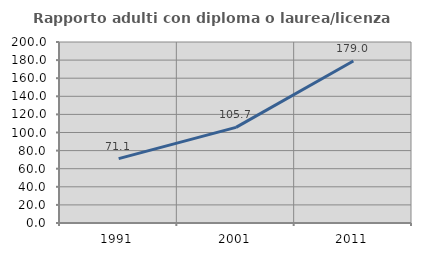
| Category | Rapporto adulti con diploma o laurea/licenza media  |
|---|---|
| 1991.0 | 71.141 |
| 2001.0 | 105.7 |
| 2011.0 | 178.993 |